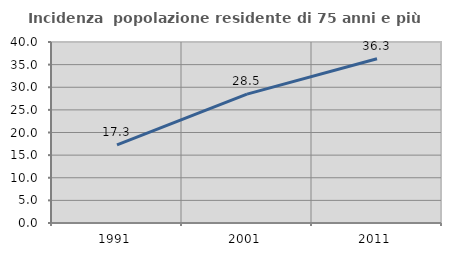
| Category | Incidenza  popolazione residente di 75 anni e più |
|---|---|
| 1991.0 | 17.273 |
| 2001.0 | 28.488 |
| 2011.0 | 36.296 |